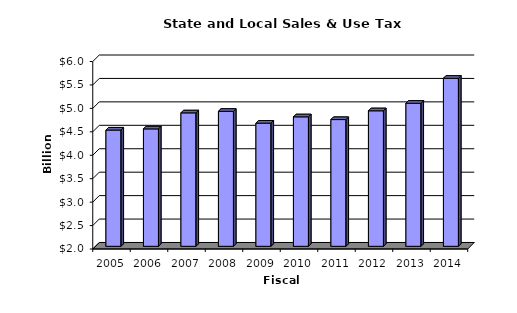
| Category | Series 0 |
|---|---|
| 2005.0 | 4.48 |
| 2006.0 | 4.505 |
| 2007.0 | 4.847 |
| 2008.0 | 4.88 |
| 2009.0 | 4.628 |
| 2010.0 | 4.762 |
| 2011.0 | 4.704 |
| 2012.0 | 4.891 |
| 2013.0 | 5.052 |
| 2014.0 | 5.585 |